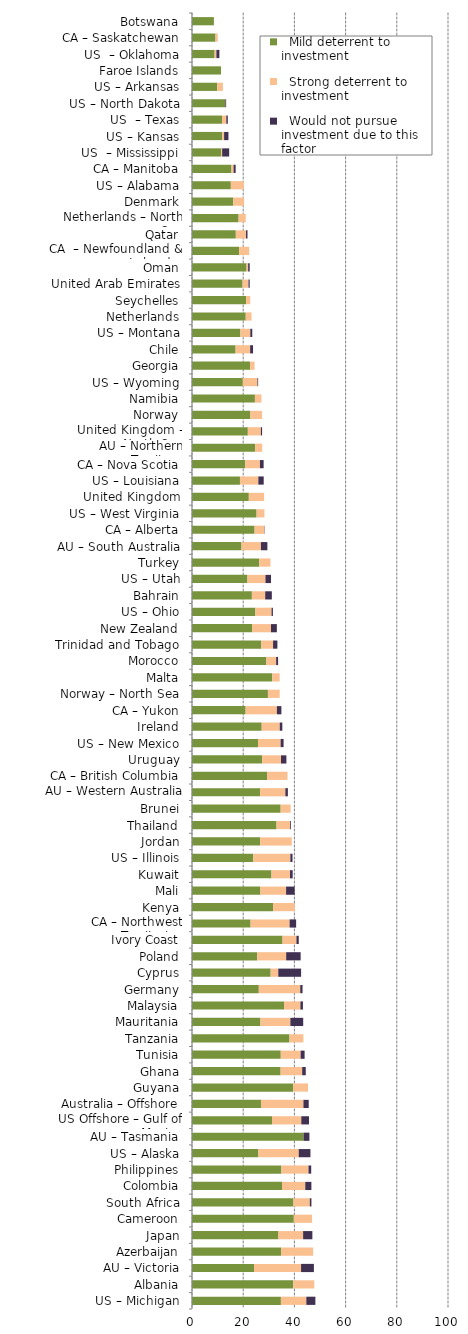
| Category |   Mild deterrent to investment |   Strong deterrent to investment |   Would not pursue investment due to this factor |
|---|---|---|---|
| US – Michigan | 34.73 | 9.923 | 3.544 |
| Albania | 39.532 | 8.236 | 0 |
| AU – Victoria | 24.225 | 18.378 | 5.012 |
| Azerbaijan | 34.817 | 12.498 | 0 |
| Japan | 33.759 | 9.645 | 3.617 |
| Cameroon | 39.775 | 7.124 | 0 |
| South Africa | 39.622 | 6.391 | 0.639 |
| Colombia | 35.156 | 9.088 | 2.392 |
| Philippines | 34.926 | 10.584 | 1.058 |
| US – Alaska | 25.932 | 15.763 | 4.576 |
| AU – Tasmania | 43.569 | 0 | 2.293 |
| US Offshore – Gulf of Mexico | 31.267 | 11.424 | 3.006 |
| Australia – Offshore | 26.943 | 16.58 | 2.073 |
| Guyana | 39.47 | 5.847 | 0 |
| Ghana | 34.617 | 8.42 | 1.403 |
| Tunisia | 34.671 | 7.762 | 1.552 |
| Tanzania | 38.076 | 5.439 | 0 |
| Mauritania | 26.731 | 11.695 | 5.012 |
| Malaysia | 35.946 | 6.401 | 0.985 |
| Germany | 26.089 | 16.193 | 0.9 |
| Cyprus | 30.724 | 2.973 | 8.92 |
| Poland | 25.465 | 11.318 | 5.659 |
| Ivory Coast | 35.357 | 5.439 | 0.907 |
| CA – Northwest Territories | 22.881 | 15.254 | 2.542 |
| Kenya | 31.674 | 8.528 | 0 |
| Mali | 26.731 | 10.024 | 3.341 |
| Kuwait | 31.048 | 7.245 | 1.035 |
| US – Illinois | 23.902 | 14.512 | 0.854 |
| Jordan | 26.673 | 12.31 | 0 |
| Thailand | 33.01 | 5.344 | 0.314 |
| Brunei | 34.627 | 3.92 | 0 |
| AU – Western Australia | 26.609 | 9.855 | 0.986 |
| CA – British Columbia | 29.351 | 7.963 | 0 |
| Uruguay | 27.393 | 7.375 | 2.107 |
| US – New Mexico | 25.775 | 8.848 | 1.154 |
| Ireland | 27.221 | 7.057 | 1.008 |
| CA – Yukon | 20.946 | 12.219 | 1.746 |
| Norway – North Sea | 29.655 | 4.594 | 0 |
| Malta | 31.377 | 2.852 | 0 |
| Morocco | 29.046 | 3.822 | 0.764 |
| Trinidad and Tobago | 27.021 | 4.644 | 1.689 |
| New Zealand | 23.482 | 7.367 | 2.302 |
| US – Ohio | 24.76 | 6.322 | 0.527 |
| Bahrain | 23.39 | 5.198 | 2.599 |
| US – Utah | 21.657 | 7.039 | 2.166 |
| Turkey | 26.267 | 4.378 | 0 |
| AU – South Australia | 19.351 | 7.572 | 2.524 |
| CA – Alberta | 24.444 | 3.834 | 0.12 |
| US – West Virginia | 25.224 | 3.057 | 0 |
| United Kingdom | 22.191 | 5.992 | 0 |
| US – Louisiana | 18.733 | 7.178 | 2.101 |
| CA – Nova Scotia | 20.807 | 5.74 | 1.435 |
| AU – Northern Territory | 24.669 | 2.741 | 0 |
| United Kingdom – North Sea | 21.812 | 5.105 | 0.464 |
| Norway | 22.809 | 4.562 | 0 |
| Namibia | 24.576 | 2.542 | 0 |
| US – Wyoming | 19.854 | 5.711 | 0.272 |
| Georgia | 22.692 | 1.746 | 0 |
| Chile | 17.031 | 5.677 | 1.135 |
| US – Montana | 18.913 | 3.86 | 0.772 |
| Netherlands | 20.991 | 2.249 | 0 |
| Seychelles | 21.116 | 1.624 | 0 |
| United Arab Emirates | 19.726 | 2.348 | 0.47 |
| Oman | 21.319 | 0.609 | 0.609 |
| CA  – Newfoundland & Labrador | 18.396 | 3.942 | 0 |
| Qatar | 17.115 | 3.993 | 0.57 |
| Netherlands – North Sea | 18.208 | 2.801 | 0 |
| Denmark | 16.102 | 4.237 | 0 |
| US – Alabama | 15.172 | 5.057 | 0 |
| CA – Manitoba | 15.431 | 0.812 | 0.812 |
| US  – Mississippi | 11.381 | 0.392 | 2.747 |
| US – Kansas | 11.864 | 0.678 | 1.695 |
| US  – Texas | 11.724 | 1.675 | 0.591 |
| US – North Dakota | 13.028 | 0 | 0.303 |
| US – Arkansas | 9.794 | 2.304 | 0 |
| Faroe Islands | 11.318 | 0 | 0 |
| US  – Oklahoma | 8.835 | 0.698 | 1.163 |
| CA – Saskatchewan | 9.178 | 0.888 | 0 |
| Botswana | 8.557 | 0 | 0 |